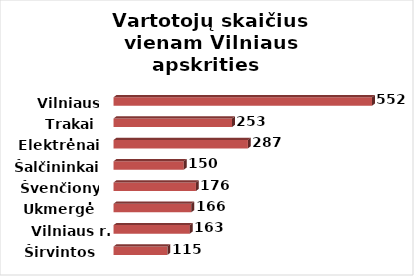
| Category | Series 0 |
|---|---|
| Širvintos | 115 |
| Vilniaus r. | 163 |
| Ukmergė | 166 |
| Švenčionys | 176 |
| Šalčininkai | 150 |
| Elektrėnai | 287 |
| Trakai | 253 |
| Vilniaus m. | 552 |